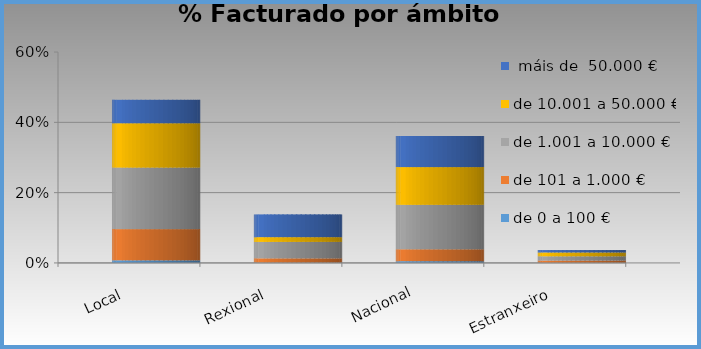
| Category | de 0 a 100 € | de 101 a 1.000 € | de 1.001 a 10.000 € | de 10.001 a 50.000 € |  máis de  50.000 € |
|---|---|---|---|---|---|
| Local | 0.007 | 0.089 | 0.175 | 0.126 | 0.067 |
| Rexional | 0.001 | 0.012 | 0.047 | 0.014 | 0.065 |
| Nacional | 0.005 | 0.034 | 0.126 | 0.107 | 0.088 |
| Estranxeiro | 0 | 0.006 | 0.012 | 0.011 | 0.007 |